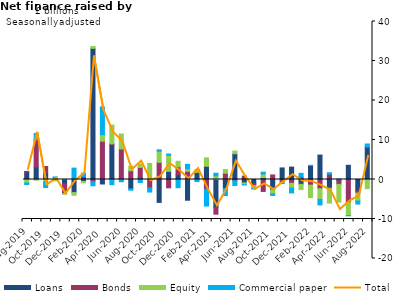
| Category | Loans | Bonds | Equity | Commercial paper |
|---|---|---|---|---|
| Aug-2019 | 1.882 | 0.174 | -0.905 | -0.357 |
| Sep-2019 | 3.134 | 6.981 | -0.182 | 1.548 |
| Oct-2019 | 1.641 | 1.651 | -0.604 | -1.416 |
| Nov-2019 | -0.032 | -0.195 | -0.109 | 0.654 |
| Dec-2019 | -1.134 | -2.415 | -0.199 | 0.031 |
| Jan-2020 | -3.307 | 0.155 | -0.699 | 2.731 |
| Feb-2020 | -0.49 | 0.764 | -0.334 | 0.826 |
| Mar-2020 | 33.199 | -0.54 | 0.461 | -1.041 |
| Apr-2020 | -1.137 | 9.698 | 1.648 | 7.014 |
| May-2020 | 8.886 | 0.131 | 4.774 | -1.303 |
| Jun-2020 | 0.22 | 7.494 | 3.801 | -0.564 |
| Jul-2020 | -2.37 | 2.212 | 1.158 | -0.34 |
| Aug-2020 | 0.45 | 2.614 | 0.852 | -0.762 |
| Sep-2020 | 0.207 | -2.122 | 3.877 | -1.058 |
| Oct-2020 | -5.795 | 4.349 | 2.805 | 0.366 |
| Nov-2020 | 2.065 | -2.106 | 4.056 | 0.327 |
| Dec-2020 | 1.191 | 2.015 | 1.401 | -2.076 |
| Jan-2021 | -5.247 | 2.081 | 0.642 | 1.11 |
| Feb-2021 | 1.622 | 0.193 | 0.72 | -0.517 |
| Mar-2021 | 3.353 | -2.452 | 2.13 | -4.272 |
| Apr-2021 | -7.031 | -1.754 | 0.929 | 0.65 |
| May-2021 | -2.267 | 1.596 | 0.924 | -1.817 |
| Jun-2021 | 6.519 | -0.338 | 0.676 | -1.166 |
| Jul-2021 | -0.859 | 0.867 | -0.445 | -0.072 |
| Aug-2021 | -1.079 | -0.499 | -0.676 | -0.136 |
| Sep-2021 | 0.466 | -3.026 | 0.91 | 0.481 |
| Oct-2021 | -2.596 | 1.158 | -1.013 | -0.446 |
| Nov-2021 | 2.93 | -0.729 | -0.211 | -0.107 |
| Dec-2021 | 3.146 | -0.957 | -1.191 | -1.25 |
| Jan-2022 | -1.217 | 0.598 | -1.332 | 0.961 |
| Feb-2022 | 3.542 | -1.431 | -3.155 | 0.058 |
| Mar-2022 | 6.185 | -2.323 | -2.712 | -1.403 |
| Apr-2022 | -2.223 | 1.362 | -3.744 | 0.359 |
| May-2022 | -0.294 | -0.942 | -4.482 | 0.142 |
| Jun-2022 | 3.6 | -5.816 | -3.303 | -0.081 |
| Jul-2022 | -2.894 | -0.555 | -1.98 | -0.789 |
| Aug-2022 | 8.075 | 0.173 | -2.32 | 0.742 |